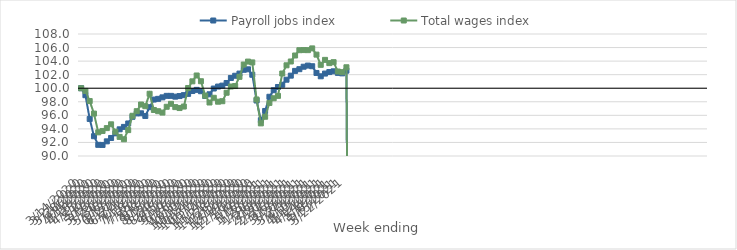
| Category | Payroll jobs index | Total wages index |
|---|---|---|
| 14/03/2020 | 100 | 100 |
| 21/03/2020 | 98.971 | 99.605 |
| 28/03/2020 | 95.467 | 98.107 |
| 04/04/2020 | 92.92 | 96.258 |
| 11/04/2020 | 91.648 | 93.491 |
| 18/04/2020 | 91.631 | 93.694 |
| 25/04/2020 | 92.162 | 94.113 |
| 02/05/2020 | 92.658 | 94.675 |
| 09/05/2020 | 93.343 | 93.583 |
| 16/05/2020 | 93.936 | 92.817 |
| 23/05/2020 | 94.293 | 92.47 |
| 30/05/2020 | 94.8 | 93.82 |
| 06/06/2020 | 95.784 | 95.934 |
| 13/06/2020 | 96.283 | 96.613 |
| 20/06/2020 | 96.299 | 97.596 |
| 27/06/2020 | 95.908 | 97.351 |
| 04/07/2020 | 97.201 | 99.182 |
| 11/07/2020 | 98.328 | 96.791 |
| 18/07/2020 | 98.432 | 96.609 |
| 25/07/2020 | 98.653 | 96.408 |
| 01/08/2020 | 98.875 | 97.263 |
| 08/08/2020 | 98.872 | 97.698 |
| 15/08/2020 | 98.757 | 97.212 |
| 22/08/2020 | 98.844 | 97.073 |
| 29/08/2020 | 98.982 | 97.295 |
| 05/09/2020 | 99.167 | 100.035 |
| 12/09/2020 | 99.586 | 101.016 |
| 19/09/2020 | 99.757 | 101.878 |
| 26/09/2020 | 99.556 | 101.032 |
| 03/10/2020 | 98.852 | 98.907 |
| 10/10/2020 | 99.105 | 97.892 |
| 17/10/2020 | 99.955 | 98.589 |
| 24/10/2020 | 100.247 | 98.012 |
| 31/10/2020 | 100.384 | 98.084 |
| 07/11/2020 | 100.771 | 99.334 |
| 14/11/2020 | 101.516 | 100.252 |
| 21/11/2020 | 101.84 | 100.323 |
| 28/11/2020 | 102.16 | 101.68 |
| 05/12/2020 | 102.718 | 103.493 |
| 12/12/2020 | 102.789 | 103.93 |
| 19/12/2020 | 101.986 | 103.809 |
| 26/12/2020 | 98.188 | 98.338 |
| 02/01/2021 | 95.282 | 94.812 |
| 09/01/2021 | 96.645 | 95.793 |
| 16/01/2021 | 98.738 | 97.83 |
| 23/01/2021 | 99.703 | 98.519 |
| 30/01/2021 | 100.182 | 98.873 |
| 06/02/2021 | 100.516 | 102.171 |
| 13/02/2021 | 101.256 | 103.38 |
| 20/02/2021 | 101.855 | 103.943 |
| 27/02/2021 | 102.556 | 104.829 |
| 06/03/2021 | 102.809 | 105.611 |
| 13/03/2021 | 103.171 | 105.63 |
| 20/03/2021 | 103.339 | 105.616 |
| 27/03/2021 | 103.246 | 105.876 |
| 03/04/2021 | 102.251 | 104.958 |
| 10/04/2021 | 101.76 | 103.45 |
| 17/04/2021 | 102.161 | 104.184 |
| 24/04/2021 | 102.386 | 103.705 |
| 01/05/2021 | 102.495 | 103.842 |
| 08/05/2021 | 102.264 | 102.466 |
| 15/05/2021 | 102.191 | 102.371 |
| 22/05/2021 | 102.592 | 103.091 |